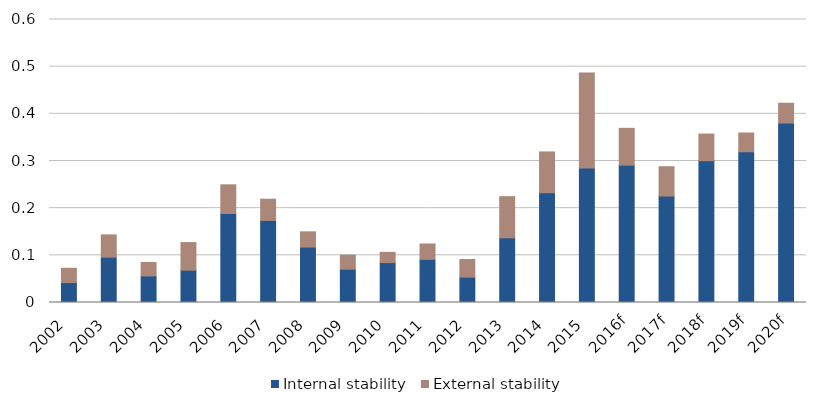
| Category | Internal stability | External stability |
|---|---|---|
| 2002 | 0.042 | 0.03 |
| 2003 | 0.096 | 0.047 |
| 2004 | 0.056 | 0.029 |
| 2005 | 0.069 | 0.058 |
| 2006 | 0.189 | 0.061 |
| 2007 | 0.174 | 0.045 |
| 2008 | 0.117 | 0.032 |
| 2009 | 0.071 | 0.03 |
| 2010 | 0.085 | 0.022 |
| 2011 | 0.091 | 0.033 |
| 2012 | 0.054 | 0.037 |
| 2013 | 0.137 | 0.087 |
| 2014 | 0.233 | 0.086 |
| 2015 | 0.285 | 0.202 |
| 2016f | 0.291 | 0.078 |
| 2017f | 0.226 | 0.062 |
| 2018f | 0.301 | 0.056 |
| 2019f | 0.32 | 0.04 |
| 2020f | 0.38 | 0.042 |